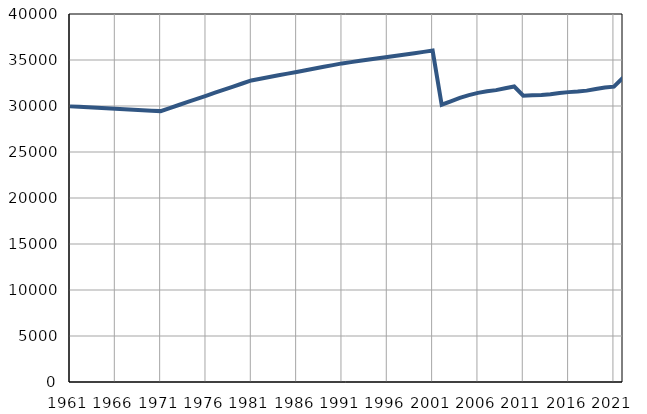
| Category | Број
становника |
|---|---|
| 1961.0 | 29959 |
| 1962.0 | 29908 |
| 1963.0 | 29856 |
| 1964.0 | 29805 |
| 1965.0 | 29753 |
| 1966.0 | 29701 |
| 1967.0 | 29650 |
| 1968.0 | 29598 |
| 1969.0 | 29547 |
| 1970.0 | 29495 |
| 1971.0 | 29444 |
| 1972.0 | 29778 |
| 1973.0 | 30110 |
| 1974.0 | 30445 |
| 1975.0 | 30778 |
| 1976.0 | 31111 |
| 1977.0 | 31445 |
| 1978.0 | 31778 |
| 1979.0 | 32113 |
| 1980.0 | 32446 |
| 1981.0 | 32779 |
| 1982.0 | 32964 |
| 1983.0 | 33149 |
| 1984.0 | 33334 |
| 1985.0 | 33519 |
| 1986.0 | 33704 |
| 1987.0 | 33890 |
| 1988.0 | 34075 |
| 1989.0 | 34260 |
| 1990.0 | 34446 |
| 1991.0 | 34631 |
| 1992.0 | 34770 |
| 1993.0 | 34909 |
| 1994.0 | 35049 |
| 1995.0 | 35188 |
| 1996.0 | 35327 |
| 1997.0 | 35465 |
| 1998.0 | 35604 |
| 1999.0 | 35743 |
| 2000.0 | 35882 |
| 2001.0 | 36021 |
| 2002.0 | 30136 |
| 2003.0 | 30500 |
| 2004.0 | 30877 |
| 2005.0 | 31182 |
| 2006.0 | 31428 |
| 2007.0 | 31595 |
| 2008.0 | 31724 |
| 2009.0 | 31933 |
| 2010.0 | 32121 |
| 2011.0 | 31114 |
| 2012.0 | 31163 |
| 2013.0 | 31201 |
| 2014.0 | 31282 |
| 2015.0 | 31421 |
| 2016.0 | 31509 |
| 2017.0 | 31576 |
| 2018.0 | 31670 |
| 2019.0 | 31846 |
| 2020.0 | 32010 |
| 2021.0 | 32104 |
| 2022.0 | 33091 |